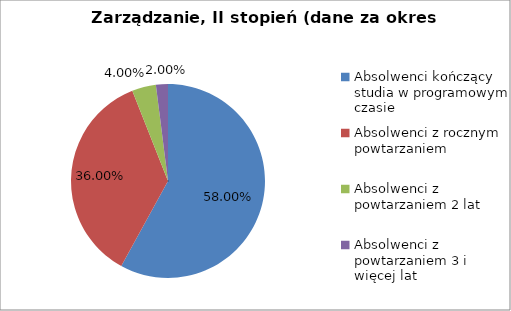
| Category | Series 0 |
|---|---|
| Absolwenci kończący studia w programowym czasie | 58 |
| Absolwenci z rocznym powtarzaniem | 36 |
| Absolwenci z powtarzaniem 2 lat | 4 |
| Absolwenci z powtarzaniem 3 i więcej lat | 2 |